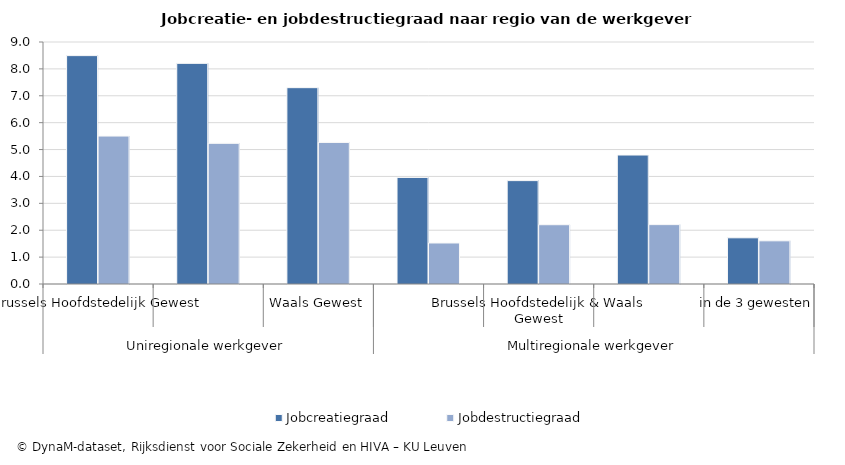
| Category | Jobcreatiegraad | Jobdestructiegraad |
|---|---|---|
| 0 | 8.494 | 5.502 |
| 1 | 8.206 | 5.231 |
| 2 | 7.302 | 5.265 |
| 3 | 3.964 | 1.525 |
| 4 | 3.845 | 2.204 |
| 5 | 4.797 | 2.209 |
| 6 | 1.718 | 1.606 |